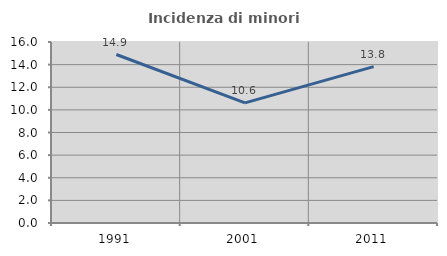
| Category | Incidenza di minori stranieri |
|---|---|
| 1991.0 | 14.894 |
| 2001.0 | 10.619 |
| 2011.0 | 13.821 |